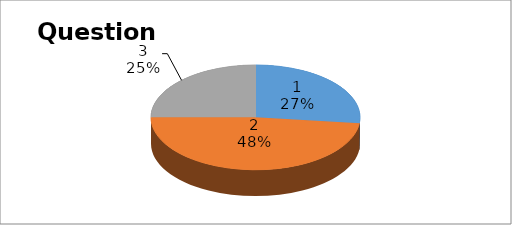
| Category | Series 0 |
|---|---|
| 0 | 15 |
| 1 | 27 |
| 2 | 14 |